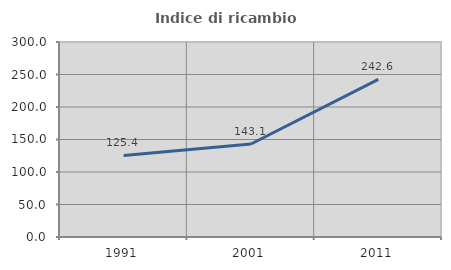
| Category | Indice di ricambio occupazionale  |
|---|---|
| 1991.0 | 125.397 |
| 2001.0 | 143.103 |
| 2011.0 | 242.553 |